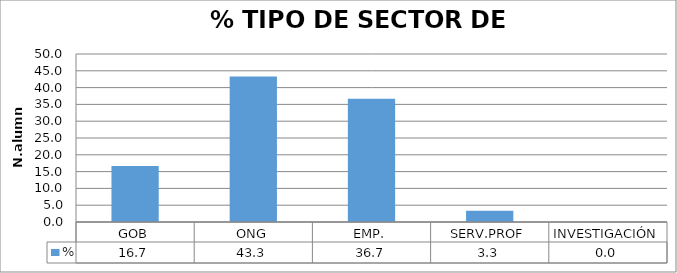
| Category | % |
|---|---|
| GOB | 16.667 |
| ONG | 43.333 |
| EMP. | 36.667 |
| SERV.PROF | 3.333 |
| INVESTIGACIÓN | 0 |